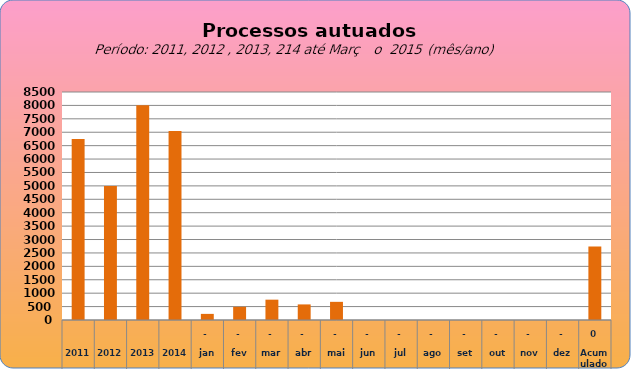
| Category | 6749 4998 8003 7049  228   487   758   581   677   -     -     -     -     -     -     -     2.731  |
|---|---|
| 2011 | 6749 |
| 2012 | 4998 |
| 2013 | 8003 |
| 2014 | 7049 |
| jan | 228 |
| fev | 492 |
| mar | 758 |
| abr | 581 |
| mai | 677 |
| jun | 0 |
| jul | 0 |
| ago | 0 |
| set | 0 |
| out | 0 |
| nov | 0 |
| dez | 0 |
| Acumulado
 | 2736 |